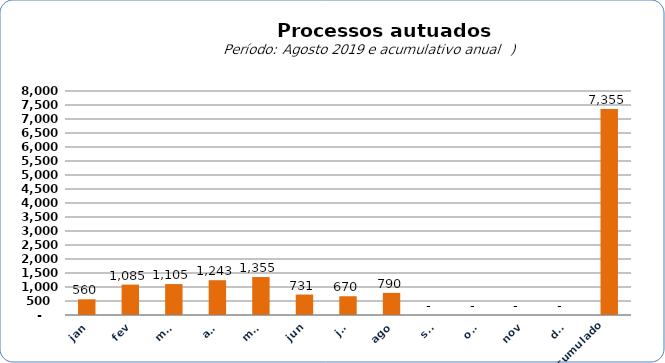
| Category |  6.735   4.276   7.967   6.893   5.569   5.644   6.997   12.080   560   1.085   1.105   1.243   1.355   731   670   790   -     -     -     -     7.355  |
|---|---|
| jan | 560 |
| fev | 1085 |
| mar | 1105 |
| abr | 1243 |
| mai | 1355 |
| jun | 731 |
| jul | 670 |
| ago | 790 |
| set | 0 |
| out | 0 |
| nov | 0 |
| dez | 0 |
| Acumulado
 | 7355 |